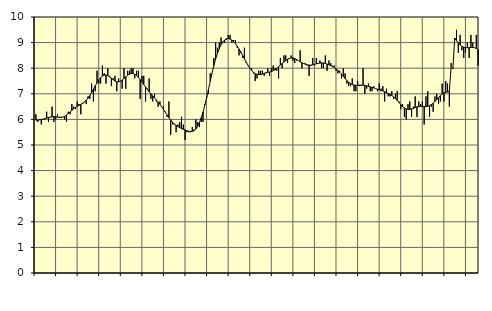
| Category | Piggar | Series 1 |
|---|---|---|
| nan | 6.2 | 5.97 |
| 1.0 | 5.9 | 5.97 |
| 1.0 | 6 | 5.98 |
| 1.0 | 5.8 | 5.99 |
| 1.0 | 6 | 6.01 |
| 1.0 | 6 | 6.03 |
| 1.0 | 6.3 | 6.05 |
| 1.0 | 5.9 | 6.07 |
| 1.0 | 6.1 | 6.09 |
| 1.0 | 6.5 | 6.1 |
| 1.0 | 5.9 | 6.11 |
| 1.0 | 6 | 6.1 |
| nan | 6.2 | 6.09 |
| 2.0 | 6.1 | 6.08 |
| 2.0 | 6.1 | 6.08 |
| 2.0 | 6.1 | 6.09 |
| 2.0 | 6 | 6.12 |
| 2.0 | 5.9 | 6.17 |
| 2.0 | 6.3 | 6.23 |
| 2.0 | 6.2 | 6.29 |
| 2.0 | 6.6 | 6.35 |
| 2.0 | 6.5 | 6.41 |
| 2.0 | 6.4 | 6.47 |
| 2.0 | 6.7 | 6.51 |
| nan | 6.6 | 6.55 |
| 3.0 | 6.2 | 6.59 |
| 3.0 | 6.6 | 6.63 |
| 3.0 | 6.7 | 6.68 |
| 3.0 | 6.6 | 6.74 |
| 3.0 | 6.9 | 6.83 |
| 3.0 | 6.8 | 6.93 |
| 3.0 | 7.4 | 7.05 |
| 3.0 | 6.7 | 7.18 |
| 3.0 | 7.1 | 7.31 |
| 3.0 | 7.9 | 7.43 |
| 3.0 | 7.4 | 7.54 |
| nan | 7.4 | 7.63 |
| 4.0 | 8.1 | 7.7 |
| 4.0 | 7.8 | 7.73 |
| 4.0 | 7.4 | 7.73 |
| 4.0 | 8 | 7.71 |
| 4.0 | 7.7 | 7.66 |
| 4.0 | 7.3 | 7.61 |
| 4.0 | 7.6 | 7.55 |
| 4.0 | 7.7 | 7.5 |
| 4.0 | 7.1 | 7.47 |
| 4.0 | 7.6 | 7.47 |
| 4.0 | 7.5 | 7.49 |
| nan | 7.2 | 7.54 |
| 5.0 | 8 | 7.6 |
| 5.0 | 7.2 | 7.66 |
| 5.0 | 7.9 | 7.73 |
| 5.0 | 7.9 | 7.77 |
| 5.0 | 8 | 7.79 |
| 5.0 | 8 | 7.79 |
| 5.0 | 7.6 | 7.76 |
| 5.0 | 7.9 | 7.71 |
| 5.0 | 7.9 | 7.64 |
| 5.0 | 6.8 | 7.55 |
| 5.0 | 7.7 | 7.46 |
| nan | 7.7 | 7.36 |
| 6.0 | 6.7 | 7.27 |
| 6.0 | 7.2 | 7.17 |
| 6.0 | 7.6 | 7.08 |
| 6.0 | 6.8 | 7 |
| 6.0 | 6.7 | 6.92 |
| 6.0 | 7 | 6.84 |
| 6.0 | 6.7 | 6.76 |
| 6.0 | 6.5 | 6.68 |
| 6.0 | 6.7 | 6.59 |
| 6.0 | 6.5 | 6.49 |
| 6.0 | 6.5 | 6.39 |
| nan | 6.3 | 6.28 |
| 7.0 | 6.1 | 6.17 |
| 7.0 | 6.7 | 6.07 |
| 7.0 | 5.4 | 5.98 |
| 7.0 | 5.8 | 5.89 |
| 7.0 | 5.8 | 5.82 |
| 7.0 | 5.5 | 5.77 |
| 7.0 | 5.8 | 5.72 |
| 7.0 | 5.9 | 5.68 |
| 7.0 | 6.1 | 5.64 |
| 7.0 | 5.8 | 5.61 |
| 7.0 | 5.2 | 5.59 |
| nan | 5.5 | 5.56 |
| 8.0 | 5.5 | 5.54 |
| 8.0 | 5.5 | 5.53 |
| 8.0 | 5.7 | 5.53 |
| 8.0 | 5.6 | 5.56 |
| 8.0 | 6 | 5.63 |
| 8.0 | 5.9 | 5.73 |
| 8.0 | 5.7 | 5.88 |
| 8.0 | 5.9 | 6.07 |
| 8.0 | 5.9 | 6.29 |
| 8.0 | 6.6 | 6.56 |
| 8.0 | 6.9 | 6.85 |
| nan | 7 | 7.17 |
| 9.0 | 7.8 | 7.49 |
| 9.0 | 7.8 | 7.81 |
| 9.0 | 8.4 | 8.1 |
| 9.0 | 9 | 8.37 |
| 9.0 | 8.8 | 8.59 |
| 9.0 | 9 | 8.77 |
| 9.0 | 9.2 | 8.92 |
| 9.0 | 9 | 9.03 |
| 9.0 | 9 | 9.1 |
| 9.0 | 9.1 | 9.15 |
| 9.0 | 9.3 | 9.16 |
| nan | 9.3 | 9.14 |
| 10.0 | 9 | 9.1 |
| 10.0 | 9.1 | 9.04 |
| 10.0 | 9.1 | 8.96 |
| 10.0 | 8.8 | 8.86 |
| 10.0 | 8.5 | 8.75 |
| 10.0 | 8.6 | 8.63 |
| 10.0 | 8.4 | 8.5 |
| 10.0 | 8.8 | 8.37 |
| 10.0 | 8.2 | 8.24 |
| 10.0 | 8.1 | 8.12 |
| 10.0 | 8 | 8.01 |
| nan | 8 | 7.92 |
| 11.0 | 7.8 | 7.84 |
| 11.0 | 7.5 | 7.79 |
| 11.0 | 7.6 | 7.76 |
| 11.0 | 7.9 | 7.75 |
| 11.0 | 7.9 | 7.75 |
| 11.0 | 7.9 | 7.77 |
| 11.0 | 7.7 | 7.8 |
| 11.0 | 7.8 | 7.82 |
| 11.0 | 8 | 7.84 |
| 11.0 | 7.7 | 7.85 |
| 11.0 | 8 | 7.87 |
| nan | 8.1 | 7.9 |
| 12.0 | 8 | 7.94 |
| 12.0 | 7.9 | 7.99 |
| 12.0 | 7.6 | 8.06 |
| 12.0 | 8.4 | 8.12 |
| 12.0 | 8 | 8.19 |
| 12.0 | 8.5 | 8.25 |
| 12.0 | 8.5 | 8.3 |
| 12.0 | 8.2 | 8.35 |
| 12.0 | 8.4 | 8.38 |
| 12.0 | 8.5 | 8.4 |
| 12.0 | 8.3 | 8.4 |
| nan | 8.2 | 8.38 |
| 13.0 | 8.3 | 8.34 |
| 13.0 | 8.3 | 8.3 |
| 13.0 | 8.7 | 8.25 |
| 13.0 | 8 | 8.21 |
| 13.0 | 8.2 | 8.18 |
| 13.0 | 8.2 | 8.15 |
| 13.0 | 8.1 | 8.13 |
| 13.0 | 7.7 | 8.12 |
| 13.0 | 8.1 | 8.12 |
| 13.0 | 8.4 | 8.13 |
| 13.0 | 8.1 | 8.15 |
| nan | 8.4 | 8.17 |
| 14.0 | 8.2 | 8.19 |
| 14.0 | 8.3 | 8.2 |
| 14.0 | 8 | 8.21 |
| 14.0 | 8 | 8.2 |
| 14.0 | 8.5 | 8.19 |
| 14.0 | 7.9 | 8.16 |
| 14.0 | 8.3 | 8.13 |
| 14.0 | 8.2 | 8.1 |
| 14.0 | 8.1 | 8.07 |
| 14.0 | 8.1 | 8.03 |
| 14.0 | 7.9 | 7.97 |
| nan | 7.8 | 7.91 |
| 15.0 | 7.9 | 7.84 |
| 15.0 | 7.6 | 7.77 |
| 15.0 | 8 | 7.68 |
| 15.0 | 7.8 | 7.6 |
| 15.0 | 7.4 | 7.52 |
| 15.0 | 7.3 | 7.45 |
| 15.0 | 7.3 | 7.4 |
| 15.0 | 7.6 | 7.36 |
| 15.0 | 7.1 | 7.34 |
| 15.0 | 7.1 | 7.33 |
| 15.0 | 7.5 | 7.33 |
| nan | 7.3 | 7.34 |
| 16.0 | 7.3 | 7.34 |
| 16.0 | 8 | 7.34 |
| 16.0 | 7 | 7.33 |
| 16.0 | 7.2 | 7.31 |
| 16.0 | 7.4 | 7.29 |
| 16.0 | 7.1 | 7.27 |
| 16.0 | 7.1 | 7.25 |
| 16.0 | 7.3 | 7.23 |
| 16.0 | 7.2 | 7.2 |
| 16.0 | 7.1 | 7.18 |
| 16.0 | 7.4 | 7.16 |
| nan | 7.2 | 7.13 |
| 17.0 | 7.3 | 7.11 |
| 17.0 | 6.7 | 7.08 |
| 17.0 | 7.2 | 7.05 |
| 17.0 | 6.9 | 7.02 |
| 17.0 | 6.9 | 6.98 |
| 17.0 | 7.1 | 6.93 |
| 17.0 | 6.8 | 6.88 |
| 17.0 | 7 | 6.81 |
| 17.0 | 7.1 | 6.74 |
| 17.0 | 6.7 | 6.66 |
| 17.0 | 6.4 | 6.58 |
| nan | 6.6 | 6.5 |
| 18.0 | 6.1 | 6.45 |
| 18.0 | 6 | 6.41 |
| 18.0 | 6.6 | 6.39 |
| 18.0 | 6.7 | 6.39 |
| 18.0 | 6.1 | 6.41 |
| 18.0 | 6.5 | 6.43 |
| 18.0 | 6.9 | 6.46 |
| 18.0 | 6.1 | 6.49 |
| 18.0 | 6.7 | 6.5 |
| 18.0 | 6.6 | 6.51 |
| 18.0 | 6.7 | 6.5 |
| nan | 5.8 | 6.5 |
| 19.0 | 6.9 | 6.5 |
| 19.0 | 7.1 | 6.51 |
| 19.0 | 6.1 | 6.54 |
| 19.0 | 6.5 | 6.58 |
| 19.0 | 6.3 | 6.63 |
| 19.0 | 6.9 | 6.7 |
| 19.0 | 7 | 6.78 |
| 19.0 | 6.6 | 6.85 |
| 19.0 | 6.7 | 6.93 |
| 19.0 | 7.4 | 6.99 |
| 19.0 | 6.7 | 7.04 |
| nan | 7.5 | 7.06 |
| 20.0 | 7.4 | 7.07 |
| 20.0 | 6.5 | 7.1 |
| 20.0 | 8.2 | 8.06 |
| 20.0 | 8 | 7.98 |
| 20.0 | 9.1 | 9.18 |
| 20.0 | 9.5 | 9.08 |
| 20.0 | 8.6 | 8.99 |
| 20.0 | 9.3 | 8.91 |
| 20.0 | 8.7 | 8.85 |
| 20.0 | 8.4 | 8.82 |
| 20.0 | 8.6 | 8.8 |
| nan | 9 | 8.8 |
| 21.0 | 8.4 | 8.81 |
| 21.0 | 9.3 | 8.81 |
| 21.0 | 9 | 8.81 |
| 21.0 | 8.8 | 8.8 |
| 21.0 | 9.3 | 8.77 |
| 21.0 | 8.1 | 8.73 |